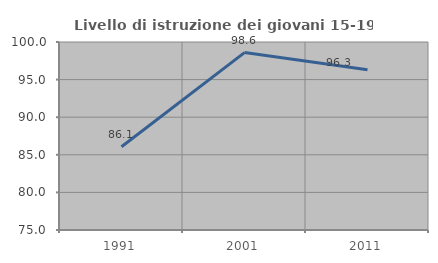
| Category | Livello di istruzione dei giovani 15-19 anni |
|---|---|
| 1991.0 | 86.066 |
| 2001.0 | 98.592 |
| 2011.0 | 96.296 |